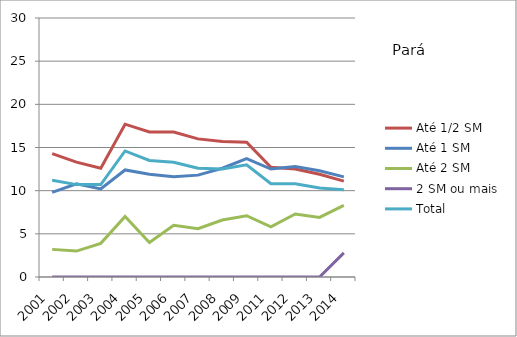
| Category | Até 1/2 SM | Até 1 SM | Até 2 SM | 2 SM ou mais | Total |
|---|---|---|---|---|---|
| 2001.0 | 14.3 | 9.8 | 3.2 | 0 | 11.2 |
| 2002.0 | 13.3 | 10.8 | 3 | 0 | 10.7 |
| 2003.0 | 12.6 | 10.2 | 3.9 | 0 | 10.7 |
| 2004.0 | 17.7 | 12.4 | 7 | 0 | 14.6 |
| 2005.0 | 16.8 | 11.9 | 4 | 0 | 13.5 |
| 2006.0 | 16.8 | 11.6 | 6 | 0 | 13.3 |
| 2007.0 | 16 | 11.8 | 5.6 | 0 | 12.6 |
| 2008.0 | 15.7 | 12.6 | 6.6 | 0 | 12.5 |
| 2009.0 | 15.6 | 13.7 | 7.1 | 0 | 13 |
| 2011.0 | 12.7 | 12.5 | 5.8 | 0 | 10.8 |
| 2012.0 | 12.5 | 12.8 | 7.3 | 0 | 10.8 |
| 2013.0 | 11.9 | 12.3 | 6.9 | 0 | 10.3 |
| 2014.0 | 11.1 | 11.6 | 8.3 | 2.8 | 10.1 |